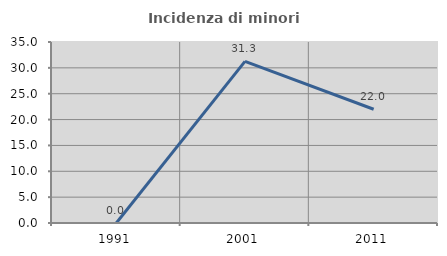
| Category | Incidenza di minori stranieri |
|---|---|
| 1991.0 | 0 |
| 2001.0 | 31.25 |
| 2011.0 | 22 |